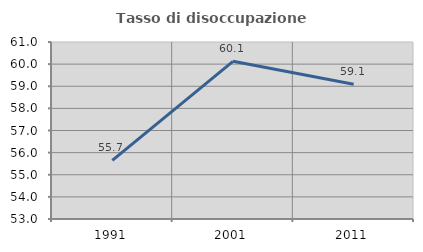
| Category | Tasso di disoccupazione giovanile  |
|---|---|
| 1991.0 | 55.652 |
| 2001.0 | 60.127 |
| 2011.0 | 59.091 |